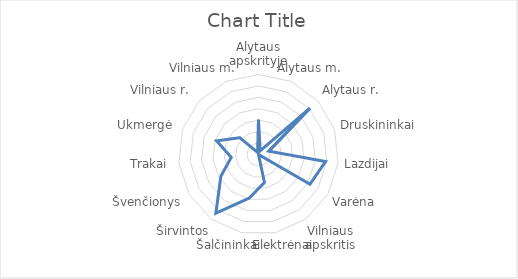
| Category | Series 0 |
|---|---|
| Alytaus apskrityje | 0.61 |
| Alytaus m. | 0.07 |
| Alytaus r. | 1.21 |
| Druskininkai | 0.19 |
| Lazdijai | 1.18 |
| Varėna | 1.04 |
| Vilniaus apskritis | 0 |
| Elektrėnai | 0.5 |
| Šalčininkai | 0.78 |
| Širvintos | 1.27 |
| Švenčionys | 0.76 |
| Trakai | 0.48 |
| Ukmergė | 0.77 |
| Vilniaus r. | 0.44 |
| Vilniaus m. | 0.04 |